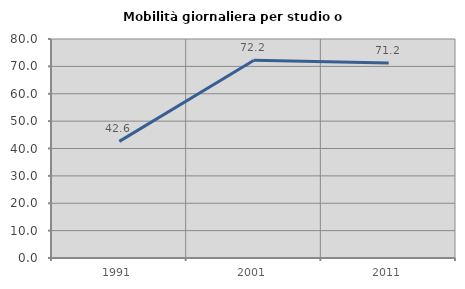
| Category | Mobilità giornaliera per studio o lavoro |
|---|---|
| 1991.0 | 42.602 |
| 2001.0 | 72.24 |
| 2011.0 | 71.2 |